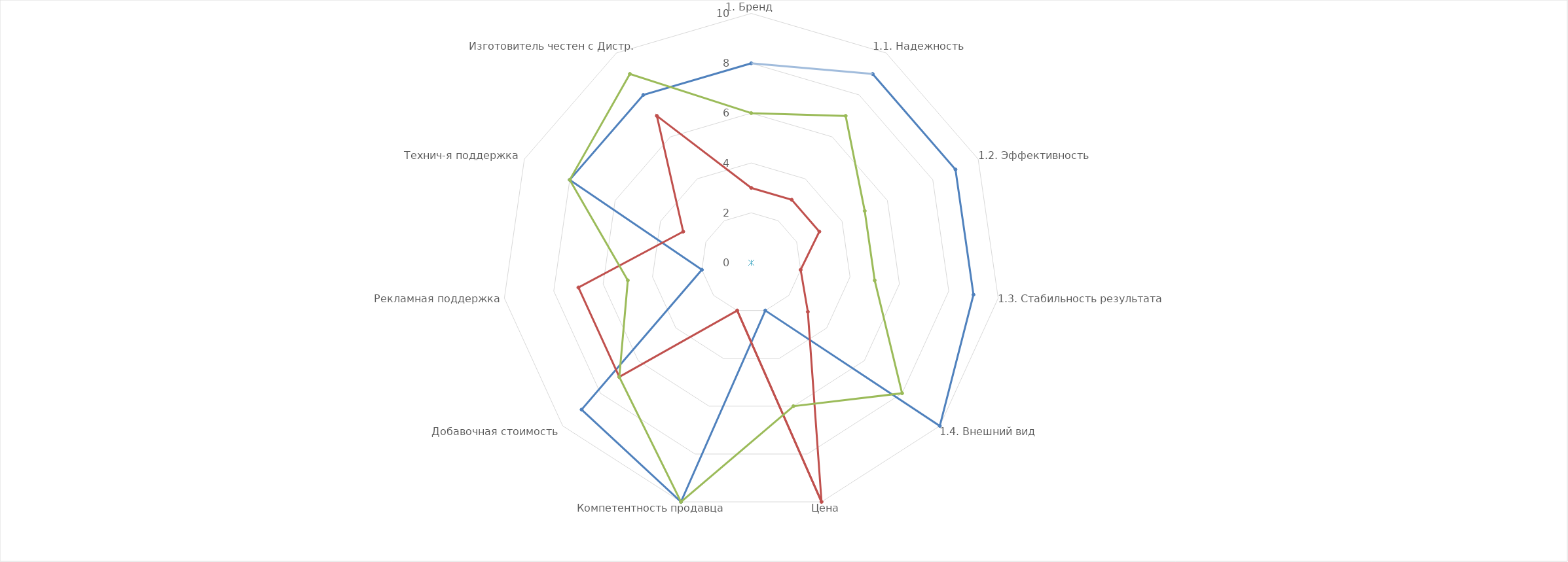
| Category | Продукт конкурента | Усреднённый массовый конкурентный продукт | Наш продукт | Иное |
|---|---|---|---|---|
| 1. Бренд | 8 | 3 | 6 | 0 |
| 1.1. Надежность | 9 | 3 | 7 | 0 |
| 1.2. Эффективность | 9 | 3 | 5 | 0 |
| 1.3. Стабильность результата | 9 | 2 | 5 | 0 |
| 1.4. Внешний вид | 10 | 3 | 8 | 0 |
| Цена | 2 | 10 | 6 | 0 |
| Компетентность продавца | 10 | 2 | 10 | 0 |
| Добавочная стоимость | 9 | 7 | 7 | 0 |
| Рекламная поддержка | 2 | 7 | 5 | 0 |
| Технич-я поддержка | 8 | 3 | 8 | 0 |
| Изготовитель честен с Дистр. | 8 | 7 | 9 | 0 |